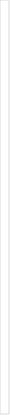
| Category | Series 1 | Series 2 | Series 3 | Series 4 |
|---|---|---|---|---|
| 0 | 1 | 1 | 1 | 1 |